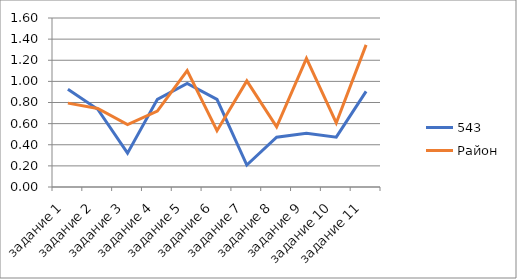
| Category | 543 | Район |
|---|---|---|
| задание 1 | 0.925 | 0.794 |
| задание 2 | 0.736 | 0.743 |
| задание 3 | 0.321 | 0.59 |
| задание 4 | 0.83 | 0.719 |
| задание 5 | 0.981 | 1.101 |
| задание 6 | 0.83 | 0.533 |
| задание 7 | 0.208 | 1.005 |
| задание 8 | 0.472 | 0.569 |
| задание 9 | 0.509 | 1.217 |
| задание 10 | 0.472 | 0.606 |
| задание 11 | 0.906 | 1.346 |